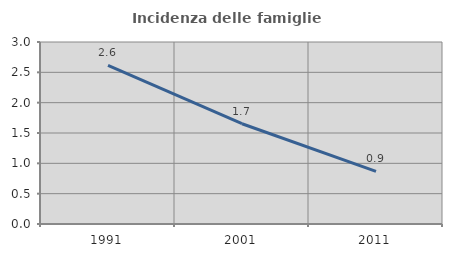
| Category | Incidenza delle famiglie numerose |
|---|---|
| 1991.0 | 2.613 |
| 2001.0 | 1.653 |
| 2011.0 | 0.868 |